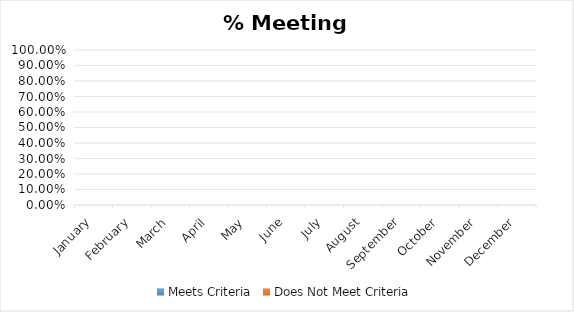
| Category | Meets Criteria | Does Not Meet Criteria |
|---|---|---|
| January | 0 | 0 |
| February | 0 | 0 |
| March | 0 | 0 |
| April | 0 | 0 |
| May | 0 | 0 |
| June | 0 | 0 |
| July | 0 | 0 |
| August | 0 | 0 |
| September | 0 | 0 |
| October | 0 | 0 |
| November | 0 | 0 |
| December | 0 | 0 |